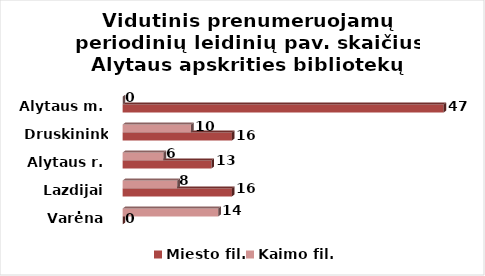
| Category | Miesto fil. | Kaimo fil. |
|---|---|---|
| Varėna | 0 | 14 |
| Lazdijai | 16 | 8 |
| Alytaus r. | 13 | 6 |
| Druskininkai | 16 | 10 |
| Alytaus m. | 47 | 0 |